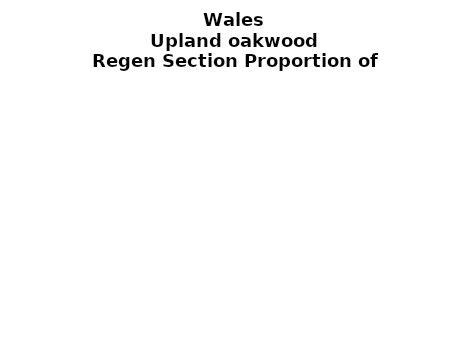
| Category | Upland oakwood |
|---|---|
| None | 0.126 |
| Seedlings only | 0 |
| Seedlings, saplings only | 0.057 |
| Seedlings, saplings, <7 cm trees | 0.117 |
| Saplings only | 0.233 |
| <7 cm trees, seedlings only | 0 |
| <7 cm trees, saplings only | 0.349 |
| <7 cm Trees only | 0.117 |